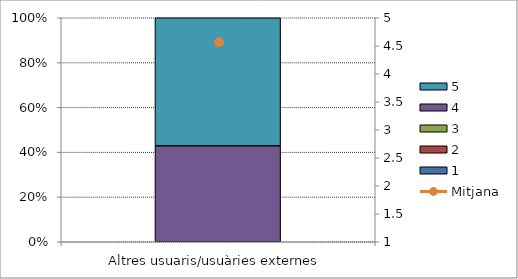
| Category | 1 | 2 | 3 | 4 | 5 |
|---|---|---|---|---|---|
| Altres usuaris/usuàries externes | 0 | 0 | 0 | 3 | 4 |